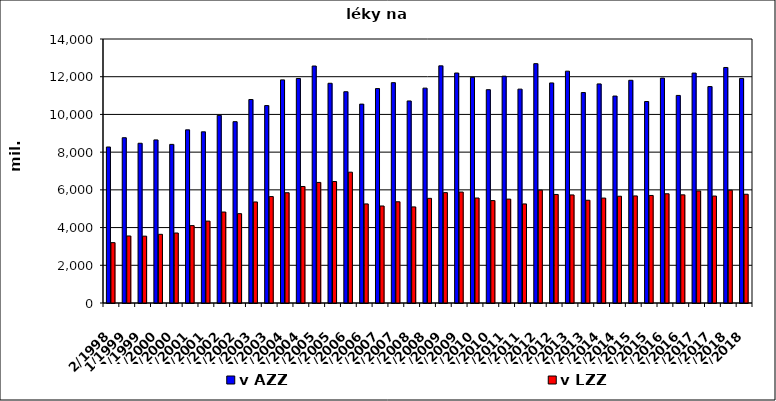
| Category | v AZZ | v LZZ |
|---|---|---|
| 2/1998 | 8272741.942 | 3200438.109 |
| 1/1999 | 8764234.255 | 3554511.928 |
| 2/1999 | 8471022.516 | 3545205.301 |
| 1/2000 | 8649107.833 | 3642394.968 |
| 2/2000 | 8411341.656 | 3712055.742 |
| 1/2001 | 9182428.931 | 4103446.04 |
| 2/2001 | 9076925.487 | 4342756.484 |
| 1/2002 | 9950747 | 4824901 |
| 2/2002 | 9616100 | 4737854 |
| 1/2003 | 10790389 | 5358398 |
| 2/2003 | 10469824.177 | 5643690.883 |
| 1/2004 | 11832026.615 | 5846797.016 |
| 2/2004 | 11906890.69 | 6178135.642 |
| 1/2005 | 12567081 | 6394301 |
| 2/2005 | 11651812.337 | 6442128.315 |
| 1/2006 | 11204013 | 6937554 |
| 2/2006 | 10546441.588 | 5253703.412 |
| 1/2007 | 11370748.356 | 5144407.644 |
| 2/2007 | 11684649.644 | 5367827.356 |
| 1/2008 | 10714532 | 5095324 |
| 2/2008 | 11394498 | 5550202 |
| 1/2009 | 12576089 | 5852792 |
| 2/2009 | 12195839 | 5884289 |
| 1/2010 | 11968899 | 5567680 |
| 2/2010 | 11311774 | 5430248 |
| 1/2011 | 12028759 | 5510002 |
| 2/2011 | 11341789 | 5253446 |
| 1/2012 | 12692977 | 5984968 |
| 2/2012 | 11670435 | 5755521 |
| 1/2013 | 12293827 | 5730255 |
| 2/2013 | 11160324 | 5448904 |
| 1/2014 | 11617993 | 5564668 |
| 2/2014 | 10974704 | 5662559 |
| 1/2015 | 11810356 | 5677912 |
| 2/2015 | 10684682 | 5702795 |
| 1/2016 | 11926658.38 | 5792716.62 |
| 2/2016 | 11007438.355 | 5735723.645 |
| 1/2017 | 12192365 | 5942299 |
| 2/2017 | 11476680 | 5672344 |
| 1/2018 | 12489873.642 | 5981613.234 |
| 2/2018 | 11909761.498 | 5766727.988 |